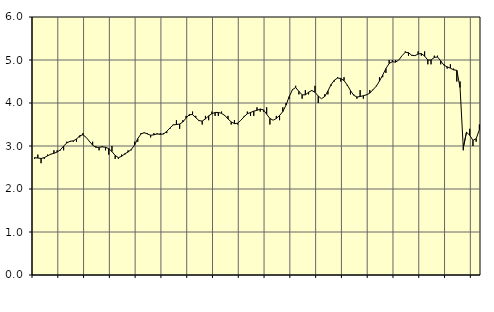
| Category | Piggar | Series 1 |
|---|---|---|
| nan | 2.7 | 2.73 |
| 87.0 | 2.8 | 2.72 |
| 87.0 | 2.6 | 2.71 |
| 87.0 | 2.7 | 2.73 |
| nan | 2.8 | 2.77 |
| 88.0 | 2.8 | 2.81 |
| 88.0 | 2.9 | 2.83 |
| 88.0 | 2.9 | 2.86 |
| nan | 2.9 | 2.91 |
| 89.0 | 2.9 | 3 |
| 89.0 | 3.1 | 3.07 |
| 89.0 | 3.1 | 3.11 |
| nan | 3.1 | 3.12 |
| 90.0 | 3.1 | 3.16 |
| 90.0 | 3.2 | 3.24 |
| 90.0 | 3.3 | 3.26 |
| nan | 3.2 | 3.2 |
| 91.0 | 3.1 | 3.11 |
| 91.0 | 3.1 | 3.02 |
| 91.0 | 3 | 2.97 |
| nan | 2.9 | 2.97 |
| 92.0 | 3 | 2.98 |
| 92.0 | 2.9 | 2.97 |
| 92.0 | 2.8 | 2.94 |
| nan | 3 | 2.87 |
| 93.0 | 2.7 | 2.78 |
| 93.0 | 2.7 | 2.73 |
| 93.0 | 2.8 | 2.76 |
| nan | 2.8 | 2.82 |
| 94.0 | 2.9 | 2.86 |
| 94.0 | 2.9 | 2.92 |
| 94.0 | 3.1 | 3.02 |
| nan | 3.1 | 3.17 |
| 95.0 | 3.3 | 3.28 |
| 95.0 | 3.3 | 3.31 |
| 95.0 | 3.3 | 3.28 |
| nan | 3.2 | 3.25 |
| 96.0 | 3.3 | 3.26 |
| 96.0 | 3.3 | 3.28 |
| 96.0 | 3.3 | 3.27 |
| nan | 3.3 | 3.28 |
| 97.0 | 3.3 | 3.34 |
| 97.0 | 3.4 | 3.42 |
| 97.0 | 3.5 | 3.49 |
| nan | 3.6 | 3.5 |
| 98.0 | 3.4 | 3.51 |
| 98.0 | 3.6 | 3.56 |
| 98.0 | 3.7 | 3.65 |
| nan | 3.7 | 3.73 |
| 99.0 | 3.8 | 3.73 |
| 99.0 | 3.7 | 3.66 |
| 99.0 | 3.6 | 3.59 |
| nan | 3.5 | 3.58 |
| 0.0 | 3.7 | 3.63 |
| 0.0 | 3.6 | 3.7 |
| 0.0 | 3.8 | 3.75 |
| nan | 3.7 | 3.78 |
| 1.0 | 3.7 | 3.78 |
| 1.0 | 3.8 | 3.76 |
| 1.0 | 3.7 | 3.71 |
| nan | 3.7 | 3.63 |
| 2.0 | 3.5 | 3.56 |
| 2.0 | 3.6 | 3.52 |
| 2.0 | 3.5 | 3.53 |
| nan | 3.6 | 3.6 |
| 3.0 | 3.7 | 3.68 |
| 3.0 | 3.8 | 3.75 |
| 3.0 | 3.7 | 3.78 |
| nan | 3.7 | 3.81 |
| 4.0 | 3.9 | 3.83 |
| 4.0 | 3.8 | 3.86 |
| 4.0 | 3.8 | 3.84 |
| nan | 3.9 | 3.74 |
| 5.0 | 3.5 | 3.64 |
| 5.0 | 3.6 | 3.6 |
| 5.0 | 3.7 | 3.64 |
| nan | 3.6 | 3.71 |
| 6.0 | 3.9 | 3.8 |
| 6.0 | 4 | 3.95 |
| 6.0 | 4.1 | 4.15 |
| nan | 4.3 | 4.31 |
| 7.0 | 4.4 | 4.36 |
| 7.0 | 4.2 | 4.27 |
| 7.0 | 4.1 | 4.19 |
| nan | 4.3 | 4.19 |
| 8.0 | 4.2 | 4.25 |
| 8.0 | 4.3 | 4.29 |
| 8.0 | 4.4 | 4.25 |
| nan | 4 | 4.16 |
| 9.0 | 4.1 | 4.1 |
| 9.0 | 4.2 | 4.15 |
| 9.0 | 4.2 | 4.28 |
| nan | 4.4 | 4.43 |
| 10.0 | 4.5 | 4.53 |
| 10.0 | 4.6 | 4.58 |
| 10.0 | 4.5 | 4.57 |
| nan | 4.6 | 4.52 |
| 11.0 | 4.4 | 4.42 |
| 11.0 | 4.2 | 4.29 |
| 11.0 | 4.2 | 4.18 |
| nan | 4.1 | 4.14 |
| 12.0 | 4.3 | 4.15 |
| 12.0 | 4.1 | 4.17 |
| 12.0 | 4.2 | 4.19 |
| nan | 4.3 | 4.23 |
| 13.0 | 4.3 | 4.31 |
| 13.0 | 4.4 | 4.39 |
| 13.0 | 4.6 | 4.51 |
| nan | 4.6 | 4.65 |
| 14.0 | 4.7 | 4.8 |
| 14.0 | 5 | 4.92 |
| 14.0 | 5 | 4.96 |
| nan | 5 | 4.95 |
| 15.0 | 5 | 5 |
| 15.0 | 5.1 | 5.1 |
| 15.0 | 5.2 | 5.18 |
| nan | 5.1 | 5.17 |
| 16.0 | 5.1 | 5.11 |
| 16.0 | 5.1 | 5.1 |
| 16.0 | 5.2 | 5.14 |
| nan | 5.1 | 5.15 |
| 17.0 | 5.2 | 5.09 |
| 17.0 | 4.9 | 5 |
| 17.0 | 4.9 | 5 |
| nan | 5.1 | 5.06 |
| 18.0 | 5.1 | 5.07 |
| 18.0 | 4.9 | 4.98 |
| 18.0 | 4.9 | 4.88 |
| nan | 4.8 | 4.84 |
| 19.0 | 4.9 | 4.81 |
| 19.0 | 4.8 | 4.77 |
| 19.0 | 4.5 | 4.76 |
| nan | 4.5 | 4.36 |
| 20.0 | 2.9 | 2.96 |
| 20.0 | 3.3 | 3.32 |
| 20.0 | 3.4 | 3.25 |
| nan | 3 | 3.13 |
| 21.0 | 3.1 | 3.17 |
| 21.0 | 3.5 | 3.38 |